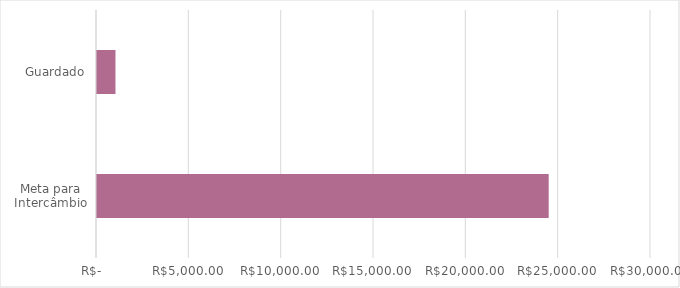
| Category | Series 0 |
|---|---|
| Meta para Intercâmbio | 24460 |
| Guardado | 1000 |